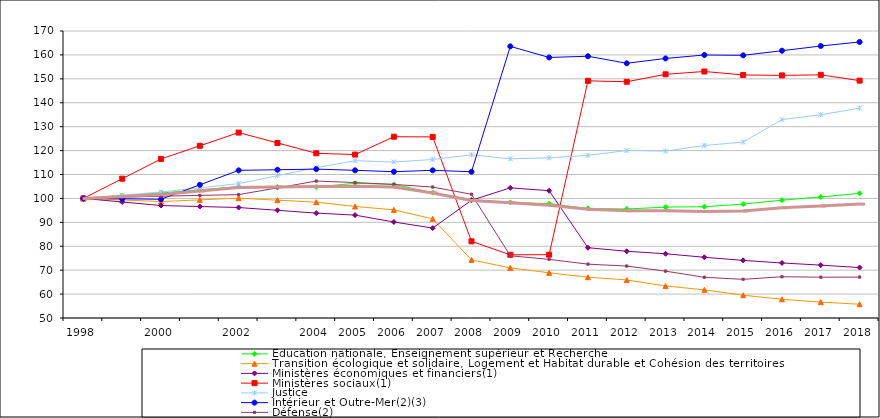
| Category | Éducation nationale, Enseignement supérieur et Recherche | Transition écologique et solidaire, Logement et Habitat durable et Cohésion des territoires | Ministères économiques et financiers(1) | Ministères sociaux(1) | Justice | Intérieur et Outre-Mer(2)(3) | Défense(2) | Ensemble |
|---|---|---|---|---|---|---|---|---|
| 1998 | 100 | 100 | 100 | 100 | 100 | 100 | 100 | 100 |
|  | 101.145 | 99.34 | 98.512 | 108.251 | 101.343 | 99.828 | 100.468 | 100.833 |
| 2000 | 102.29 | 98.679 | 97.025 | 116.502 | 102.686 | 99.656 | 100.936 | 101.665 |
|  | 103.603 | 99.393 | 96.611 | 122.012 | 104.431 | 105.694 | 101.26 | 103.116 |
| 2002 | 104.917 | 100.107 | 96.198 | 127.523 | 106.176 | 111.732 | 101.584 | 104.567 |
|  | 104.851 | 99.266 | 95.029 | 123.195 | 109.517 | 111.989 | 104.417 | 104.787 |
| 2004 | 104.784 | 98.426 | 93.86 | 118.867 | 112.859 | 112.247 | 107.25 | 105.008 |
| 2005 | 106.317 | 96.634 | 93.015 | 118.329 | 115.782 | 111.751 | 106.641 | 105.086 |
| 2006 | 105.86 | 95.22 | 90.145 | 125.802 | 115.209 | 111.169 | 105.85 | 104.729 |
| 2007 | 102.405 | 91.451 | 87.603 | 125.71 | 116.276 | 111.747 | 104.745 | 102.282 |
| 2008 | 99.468 | 74.288 | 99.237 | 82.047 | 118.247 | 111.144 | 101.741 | 99.172 |
| 2009 | 98.34 | 70.949 | 104.415 | 76.433 | 116.541 | 163.575 | 76.024 | 98.163 |
| 2010 | 97.779 | 68.897 | 103.231 | 76.476 | 116.967 | 158.934 | 74.518 | 97.149 |
| 2011 | 95.802 | 67.061 | 79.393 | 149.157 | 117.992 | 159.448 | 72.515 | 95.481 |
| 2012 | 95.569 | 65.91 | 77.903 | 148.78 | 120.036 | 156.503 | 71.72 | 94.849 |
| 2013 | 96.365 | 63.386 | 76.859 | 151.896 | 119.785 | 158.526 | 69.592 | 94.878 |
| 2014 | 96.528 | 61.784 | 75.391 | 153.076 | 122.125 | 159.968 | 67.02 | 94.561 |
| 2015 | 97.617 | 59.526 | 74.085 | 151.628 | 123.573 | 159.832 | 66.167 | 94.776 |
| 2016 | 99.266 | 57.826 | 73.009 | 151.434 | 132.956 | 161.758 | 67.251 | 96.1 |
| 2017 | 100.611 | 56.628 | 72.112 | 151.666 | 134.982 | 163.735 | 67.055 | 96.84 |
| 2018 | 102.125 | 55.76 | 71.09 | 149.256 | 137.742 | 165.419 | 67.103 | 97.62 |